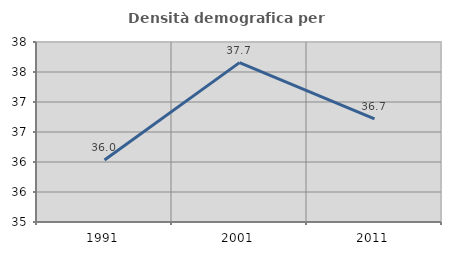
| Category | Densità demografica |
|---|---|
| 1991.0 | 36.034 |
| 2001.0 | 37.657 |
| 2011.0 | 36.717 |